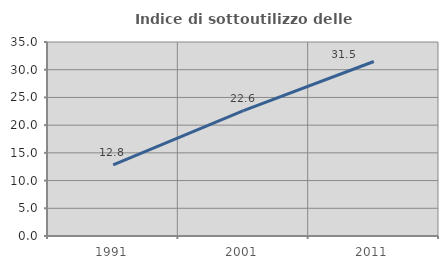
| Category | Indice di sottoutilizzo delle abitazioni  |
|---|---|
| 1991.0 | 12.812 |
| 2001.0 | 22.632 |
| 2011.0 | 31.477 |